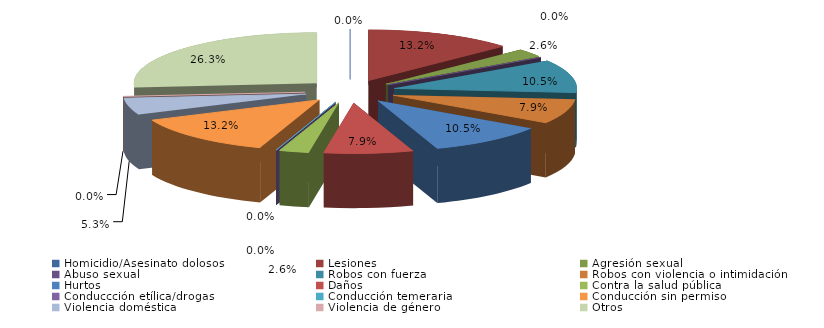
| Category | Series 0 |
|---|---|
| Homicidio/Asesinato dolosos | 0 |
| Lesiones | 5 |
| Agresión sexual | 1 |
| Abuso sexual | 0 |
| Robos con fuerza | 4 |
| Robos con violencia o intimidación | 3 |
| Hurtos | 4 |
| Daños | 3 |
| Contra la salud pública | 1 |
| Conduccción etílica/drogas | 0 |
| Conducción temeraria | 0 |
| Conducción sin permiso | 5 |
| Violencia doméstica | 2 |
| Violencia de género | 0 |
| Otros | 10 |